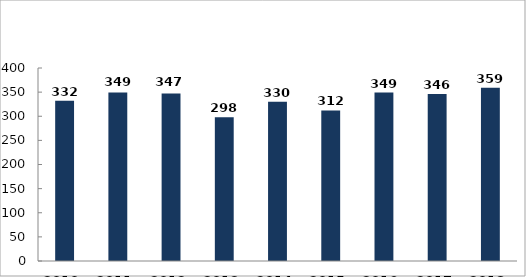
| Category | Könnyű sérüléses közúti közlekedési balesetek |
|---|---|
| 2010. év | 332 |
| 2011. év | 349 |
| 2012. év | 347 |
| 2013. év | 298 |
| 2014. év | 330 |
| 2015. év | 312 |
| 2016. év | 349 |
| 2017. év | 346 |
| 2018. év | 359 |